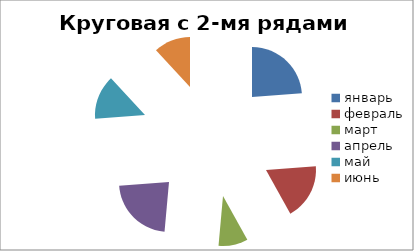
| Category | Филиал2 |
|---|---|
| январь | 50 |
| февраль | 38 |
| март | 20 |
| апрель | 47 |
| май | 30 |
| июнь | 25 |